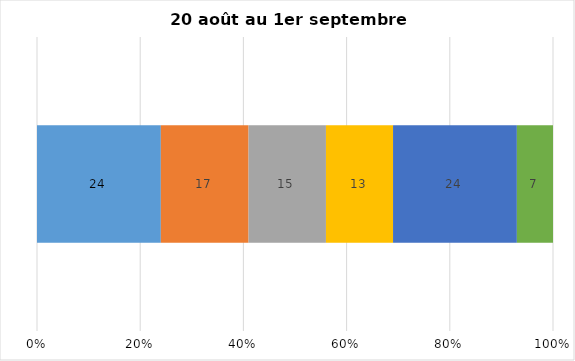
| Category | Plusieurs fois par jour | Une fois par jour | Quelques fois par semaine   | Une fois par semaine ou moins   |  Jamais   |  Je n’utilise pas les médias sociaux |
|---|---|---|---|---|---|---|
| 0 | 24 | 17 | 15 | 13 | 24 | 7 |